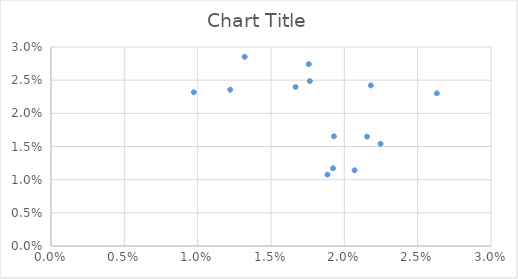
| Category | Series 0 |
|---|---|
| 0.01884865187538212 | 0.011 |
| 0.019227496627977403 | 0.012 |
| 0.013205346554800938 | 0.029 |
| 0.012221052482287798 | 0.024 |
| 0.01929113356448997 | 0.017 |
| 0.02155026537179187 | 0.016 |
| 0.026309639119987183 | 0.023 |
| 0.009739767689691899 | 0.023 |
| 0.021803139589226042 | 0.024 |
| 0.02069791427581629 | 0.011 |
| 0.022468131113960954 | 0.015 |
| 0.017573919155420337 | 0.027 |
| 0.016671326173062682 | 0.024 |
| 0.017649719775376955 | 0.025 |